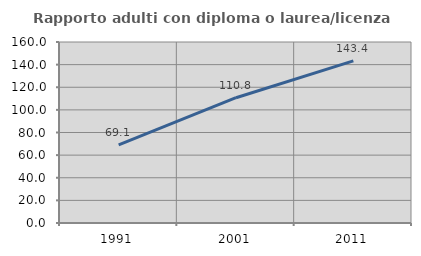
| Category | Rapporto adulti con diploma o laurea/licenza media  |
|---|---|
| 1991.0 | 69.078 |
| 2001.0 | 110.757 |
| 2011.0 | 143.362 |